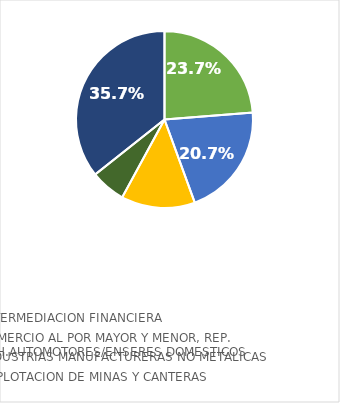
| Category | Series 0 |
|---|---|
| INTERMEDIACION FINANCIERA | 0.237 |
| COMERCIO AL POR MAYOR Y MENOR, REP. VEH.AUTOMOTORES/ENSERES DOMESTICOS | 0.207 |
| INDUSTRIAS MANUFACTURERAS NO METALICAS | 0.135 |
| EXPLOTACION DE MINAS Y CANTERAS | 0.064 |
| OTROS RUBROS | 0.357 |